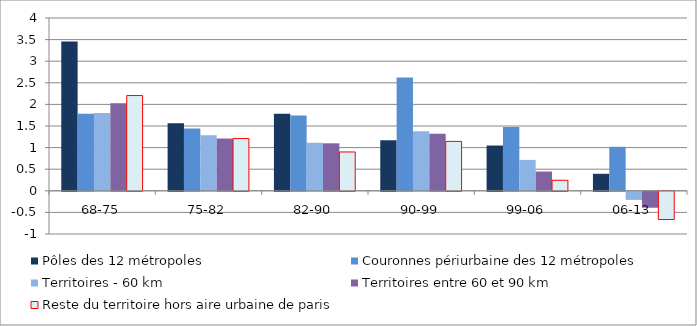
| Category | Pôles des 12 métropoles | Couronnes périurbaine des 12 métropoles | Territoires - 60 km | Territoires entre 60 et 90 km | Reste du territoire hors aire urbaine de paris |
|---|---|---|---|---|---|
| 68-75 | 3.455 | 1.783 | 1.803 | 2.027 | 2.205 |
| 75-82 | 1.563 | 1.439 | 1.288 | 1.212 | 1.212 |
| 82-90 | 1.786 | 1.744 | 1.112 | 1.1 | 0.899 |
| 90-99 | 1.172 | 2.62 | 1.38 | 1.318 | 1.144 |
| 99-06 | 1.048 | 1.476 | 0.715 | 0.446 | 0.244 |
| 06-13 | 0.394 | 1.019 | -0.187 | -0.369 | -0.653 |